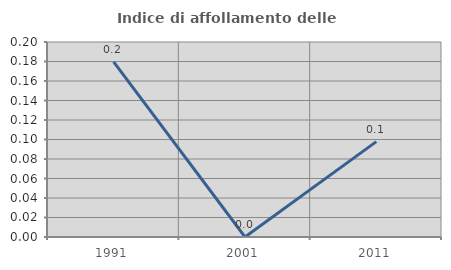
| Category | Indice di affollamento delle abitazioni  |
|---|---|
| 1991.0 | 0.18 |
| 2001.0 | 0 |
| 2011.0 | 0.098 |